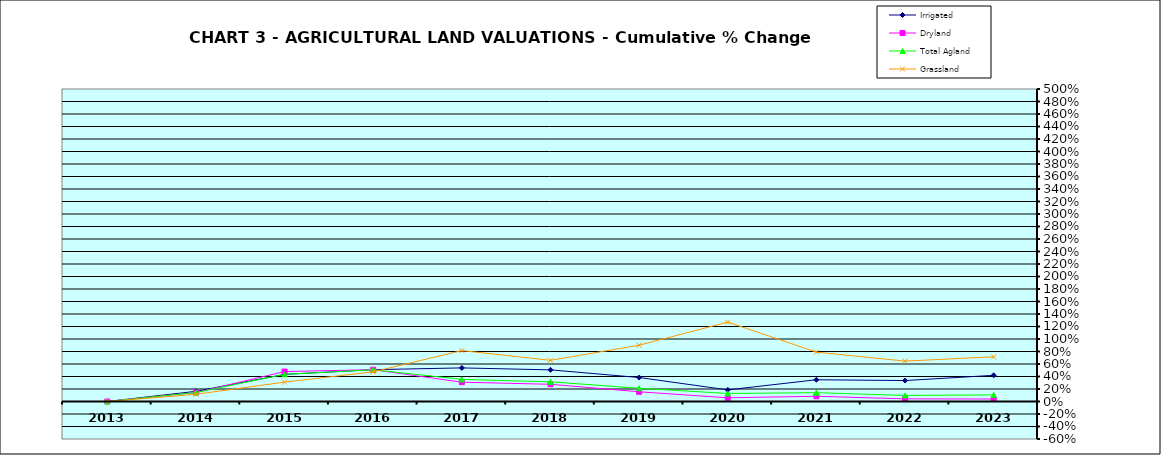
| Category | Irrigated | Dryland | Total Agland | Grassland |
|---|---|---|---|---|
| 2013.0 | 0 | 0 | 0 | 0 |
| 2014.0 | 0.163 | 0.143 | 0.143 | 0.115 |
| 2015.0 | 0.434 | 0.479 | 0.435 | 0.31 |
| 2016.0 | 0.509 | 0.509 | 0.508 | 0.475 |
| 2017.0 | 0.538 | 0.309 | 0.354 | 0.815 |
| 2018.0 | 0.506 | 0.275 | 0.315 | 0.659 |
| 2019.0 | 0.384 | 0.155 | 0.212 | 0.9 |
| 2020.0 | 0.186 | 0.059 | 0.129 | 1.27 |
| 2021.0 | 0.348 | 0.084 | 0.141 | 0.79 |
| 2022.0 | 0.335 | 0.042 | 0.097 | 0.646 |
| 2023.0 | 0.419 | 0.04 | 0.105 | 0.715 |